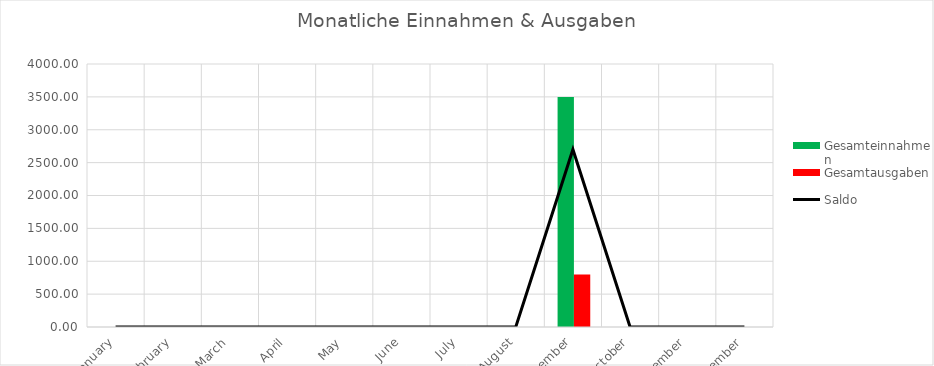
| Category | Gesamteinnahmen | Gesamtausgaben |
|---|---|---|
| 2018-01-01 | 0 | 0 |
| 2018-02-01 | 0 | 0 |
| 2018-03-01 | 0 | 0 |
| 2018-04-01 | 0 | 0 |
| 2018-05-01 | 0 | 0 |
| 2018-06-01 | 0 | 0 |
| 2018-07-01 | 0 | 0 |
| 2018-08-01 | 0 | 0 |
| 2018-09-01 | 3500 | 800 |
| 2018-10-01 | 0 | 0 |
| 2018-11-01 | 0 | 0 |
| 2018-12-01 | 0 | 0 |